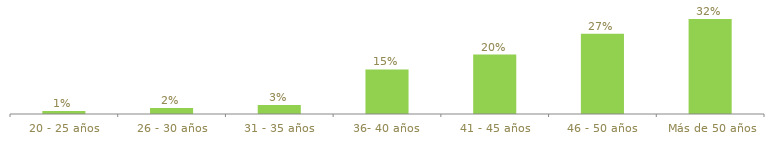
| Category | Series 0 |
|---|---|
| 20 - 25 años | 0.01 |
| 26 - 30 años | 0.02 |
| 31 - 35 años | 0.03 |
| 36- 40 años | 0.15 |
| 41 - 45 años | 0.2 |
| 46 - 50 años | 0.27 |
|  Más de 50 años | 0.32 |